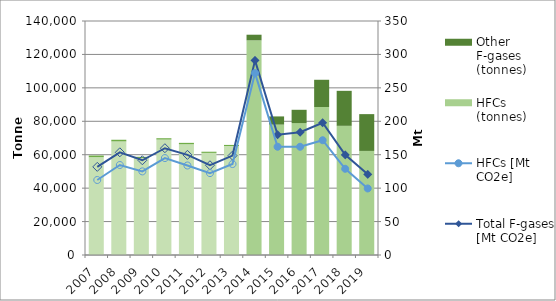
| Category | HFCs (tonnes) | Other F-gases (tonnes) |
|---|---|---|
| 2007.0 | 58519.113 | 999.375 |
| 2008.0 | 67951.232 | 997.005 |
| 2009.0 | 57946.43 | 799.774 |
| 2010.0 | 69088.691 | 769.402 |
| 2011.0 | 66269.261 | 824.68 |
| 2012.0 | 61102.296 | 684.343 |
| 2013.0 | 65220.885 | 638.211 |
| 2014.0 | 128452.036 | 3341.737 |
| 2015.0 | 78026.128 | 4883.466 |
| 2016.0 | 78938.047 | 7939.982 |
| 2017.0 | 88530.403 | 16304.717 |
| 2018.0 | 77286.174 | 20936.836 |
| 2019.0 | 62265.841 | 22018.315 |